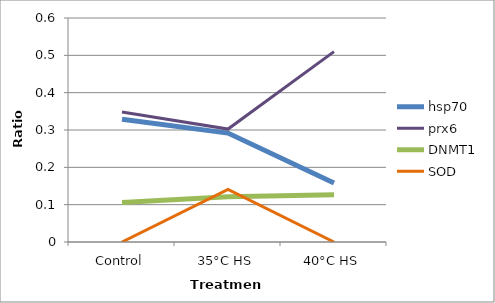
| Category | hsp70 | prx6 | DNMT1 | SOD |
|---|---|---|---|---|
| Control | 0.329 | 0.348 | 0.106 | 0 |
| 35°C HS | 0.292 | 0.303 | 0.121 | 0.141 |
| 40°C HS | 0.158 | 0.51 | 0.127 | 0 |